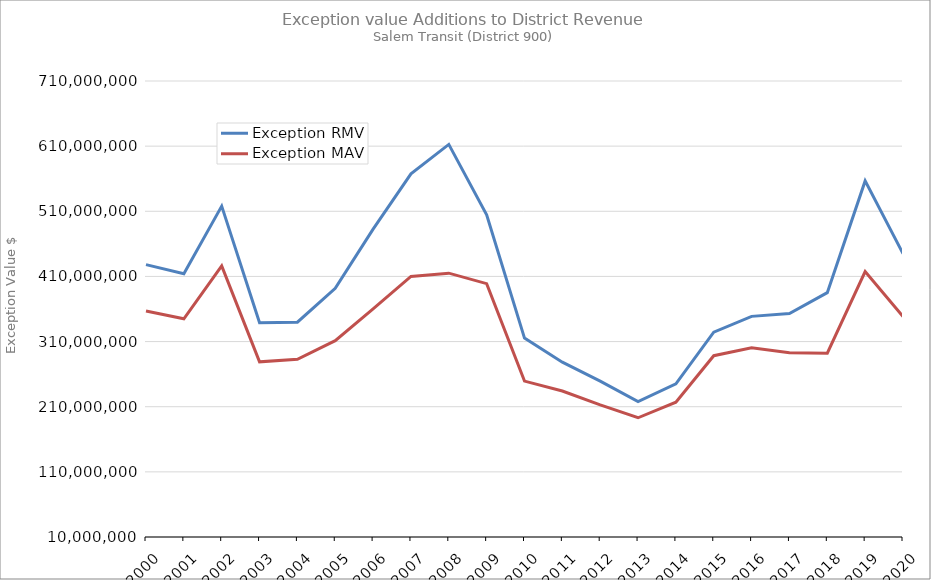
| Category | Exception RMV | Exception MAV |
|---|---|---|
| 2000.0 | 428092620 | 356833277 |
| 2001.0 | 414223709 | 344970260 |
| 2002.0 | 517927233 | 426170306 |
| 2003.0 | 338843851 | 278840094 |
| 2004.0 | 339721848 | 282679355 |
| 2005.0 | 391724532 | 311372175 |
| 2006.0 | 482562283 | 360254512 |
| 2007.0 | 567433008 | 410016786 |
| 2008.0 | 612654780 | 414991777 |
| 2009.0 | 504629770 | 398887406 |
| 2010.0 | 315319391 | 249341588 |
| 2011.0 | 278411947 | 234110224 |
| 2012.0 | 249349442 | 212715184 |
| 2013.0 | 217799005 | 193038774 |
| 2014.0 | 245059727 | 216966125 |
| 2015.0 | 324532257 | 288293543 |
| 2016.0 | 348678440 | 300502241 |
| 2017.0 | 352970457 | 292742459 |
| 2018.0 | 385110378 | 292138086 |
| 2019.0 | 556607599 | 417481198 |
| 2020.0 | 445022549 | 348525355 |